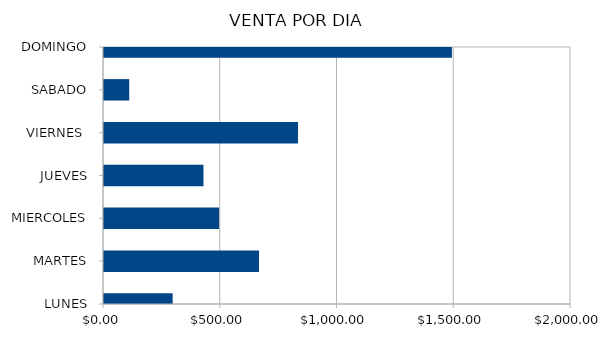
| Category | Series 0 |
|---|---|
| LUNES | 294 |
| MARTES | 664 |
| MIERCOLES | 493 |
| JUEVES | 426 |
| VIERNES  | 831 |
| SABADO | 108 |
| DOMINGO | 1490 |